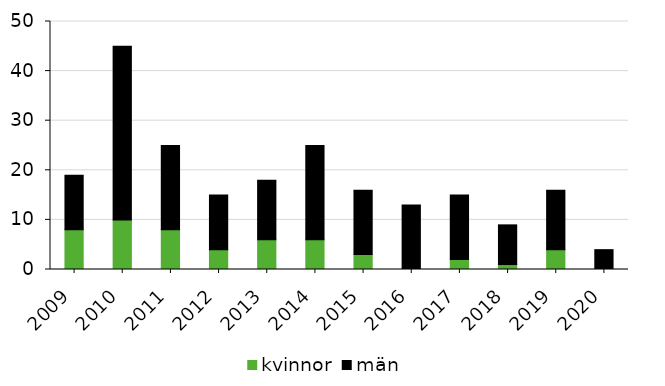
| Category | kvinnor | män |
|---|---|---|
| 2009 | 8 | 11 |
| 2010 | 10 | 35 |
| 2011 | 8 | 17 |
| 2012 | 4 | 11 |
| 2013 | 6 | 12 |
| 2014 | 6 | 19 |
| 2015 | 3 | 13 |
| 2016 | 0 | 13 |
| 2017 | 2 | 13 |
| 2018 | 1 | 8 |
| 2019 | 4 | 12 |
| 2020 | 0 | 4 |